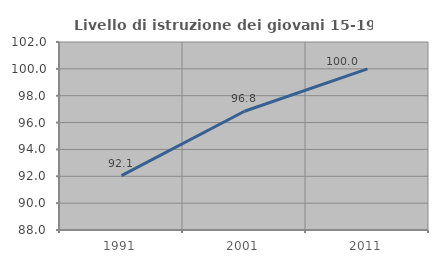
| Category | Livello di istruzione dei giovani 15-19 anni |
|---|---|
| 1991.0 | 92.053 |
| 2001.0 | 96.842 |
| 2011.0 | 100 |